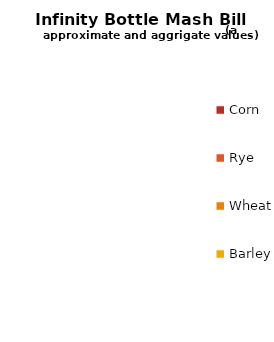
| Category | Series 0 |
|---|---|
| Corn | 0 |
| Rye | 0 |
| Wheat | 0 |
| Barley | 0 |